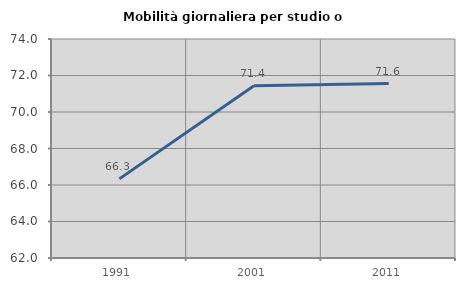
| Category | Mobilità giornaliera per studio o lavoro |
|---|---|
| 1991.0 | 66.336 |
| 2001.0 | 71.434 |
| 2011.0 | 71.555 |